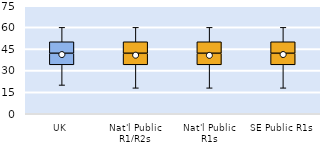
| Category | 25th | 50th | 75th |
|---|---|---|---|
| UK | 34 | 8 | 8 |
| Nat'l Public R1/R2s | 34 | 8 | 8 |
| Nat'l Public R1s | 34 | 8 | 8 |
| SE Public R1s | 34 | 8 | 8 |